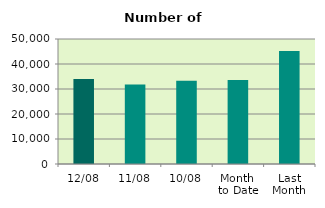
| Category | Series 0 |
|---|---|
| 12/08 | 33974 |
| 11/08 | 31806 |
| 10/08 | 33278 |
| Month 
to Date | 33648 |
| Last
Month | 45220.286 |